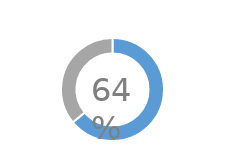
| Category | Series 0 |
|---|---|
| 0 | 0.64 |
| 1 | 0.36 |